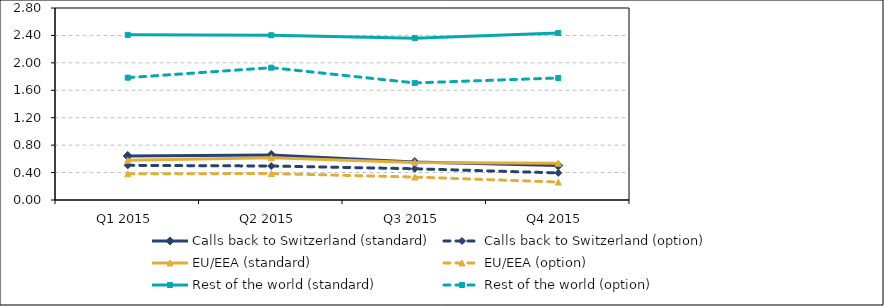
| Category | Calls back to Switzerland (standard) | Calls back to Switzerland (option) | EU/EEA (standard) | EU/EEA (option) | Rest of the world (standard) | Rest of the world (option) |
|---|---|---|---|---|---|---|
| Q1 2015 | 0.642 | 0.505 | 0.578 | 0.382 | 2.408 | 1.784 |
| Q2 2015 | 0.657 | 0.495 | 0.616 | 0.386 | 2.402 | 1.93 |
| Q3 2015 | 0.554 | 0.456 | 0.547 | 0.334 | 2.361 | 1.708 |
| Q4 2015 | 0.503 | 0.395 | 0.537 | 0.262 | 2.434 | 1.78 |